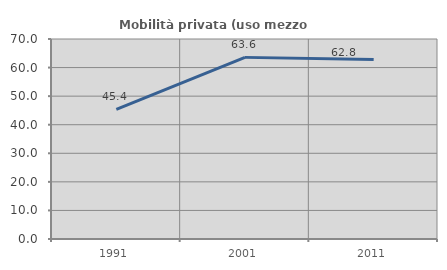
| Category | Mobilità privata (uso mezzo privato) |
|---|---|
| 1991.0 | 45.401 |
| 2001.0 | 63.569 |
| 2011.0 | 62.807 |